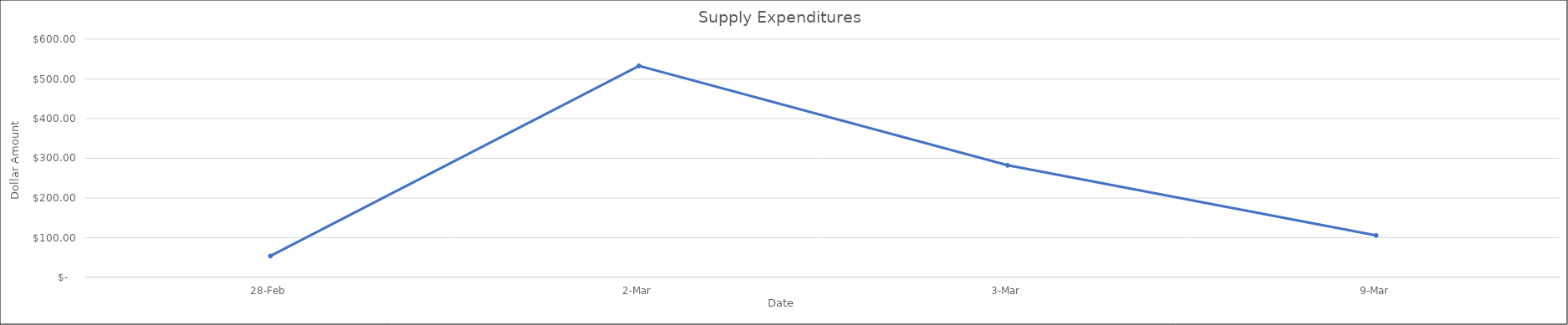
| Category | Total |
|---|---|
| 28-Feb | 53.78 |
| 2-Mar | 532.95 |
| 3-Mar | 282.5 |
| 9-Mar | 105.72 |